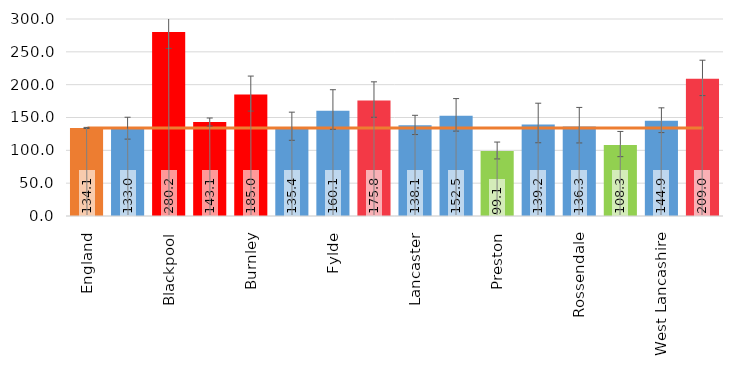
| Category | Value |
|---|---|
| England | 134.061 |
| Blackburn with Darwen | 132.962 |
| Blackpool | 280.17 |
| Lancashire-12 | 143.065 |
| Burnley | 184.989 |
| Chorley | 135.444 |
| Fylde | 160.09 |
| Hyndburn | 175.801 |
| Lancaster | 138.113 |
| Pendle | 152.534 |
| Preston | 99.142 |
| Ribble Valley | 139.245 |
| Rossendale | 136.316 |
| South Ribble | 108.3 |
| West Lancashire | 144.945 |
| Wyre | 208.989 |